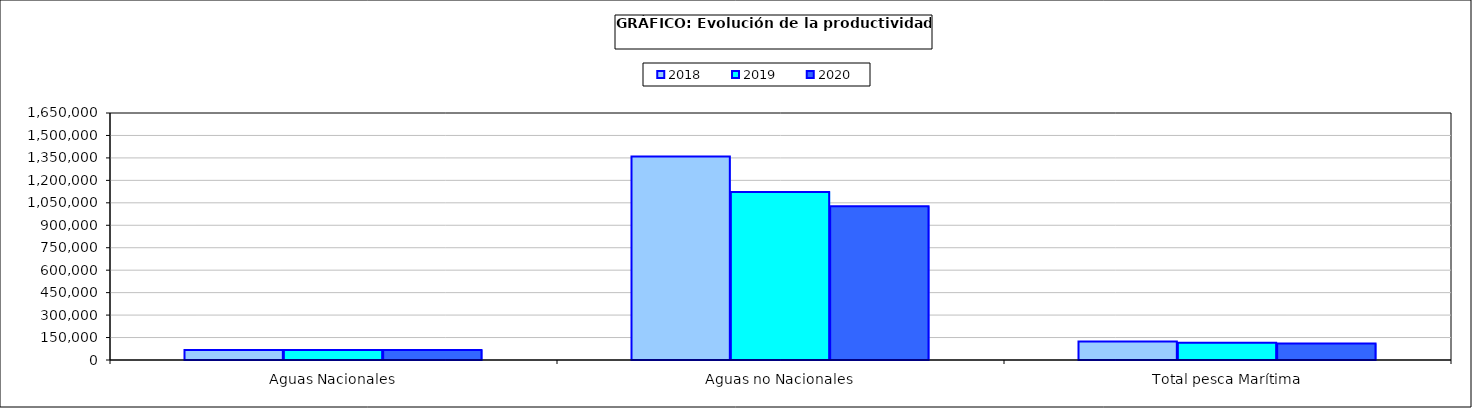
| Category | 2018 | 2019 | 2020 |
|---|---|---|---|
| 0 | 67571.06 | 67190.989 | 66113.082 |
| 1 | 1358789.456 | 1122087.946 | 1027429.335 |
| 2 | 124192.189 | 114883.345 | 109697.976 |